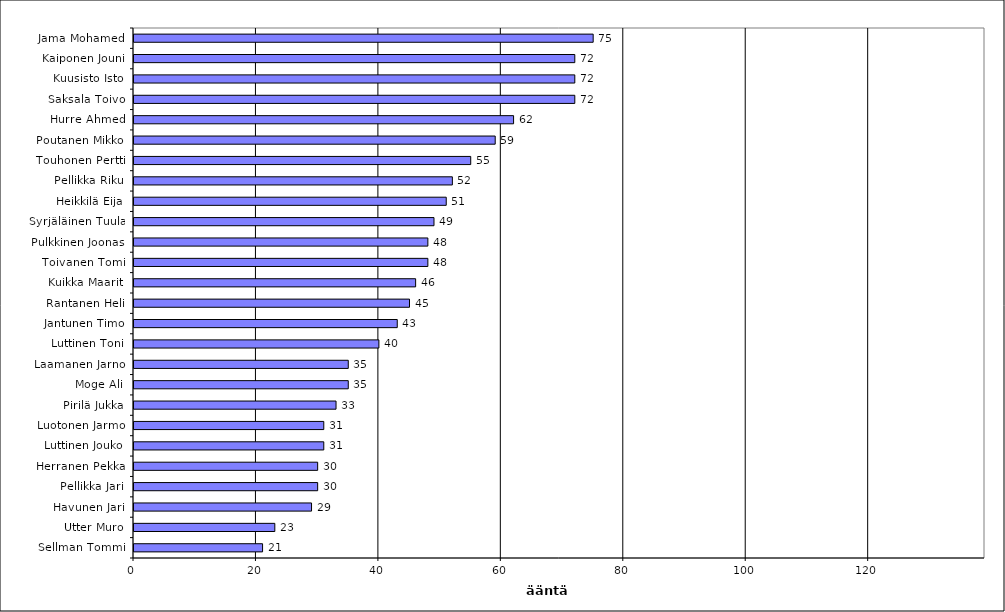
| Category | Series 0 |
|---|---|
| Jama Mohamed | 75 |
| Kaiponen Jouni | 72 |
| Kuusisto Isto | 72 |
| Saksala Toivo | 72 |
| Hurre Ahmed | 62 |
| Poutanen Mikko | 59 |
| Touhonen Pertti | 55 |
| Pellikka Riku | 52 |
| Heikkilä Eija | 51 |
| Syrjäläinen Tuula | 49 |
| Pulkkinen Joonas | 48 |
| Toivanen Tomi | 48 |
| Kuikka Maarit | 46 |
| Rantanen Heli | 45 |
| Jantunen Timo | 43 |
| Luttinen Toni | 40 |
| Laamanen Jarno | 35 |
| Moge Ali | 35 |
| Pirilä Jukka | 33 |
| Luotonen Jarmo | 31 |
| Luttinen Jouko | 31 |
| Herranen Pekka | 30 |
| Pellikka Jari | 30 |
| Havunen Jari | 29 |
| Utter Muro | 23 |
| Sellman Tommi | 21 |